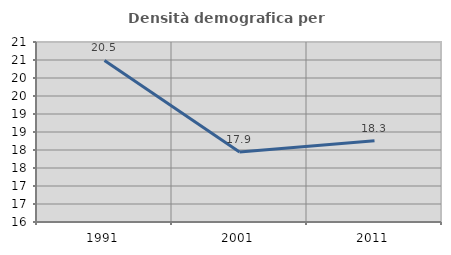
| Category | Densità demografica |
|---|---|
| 1991.0 | 20.487 |
| 2001.0 | 17.943 |
| 2011.0 | 18.257 |